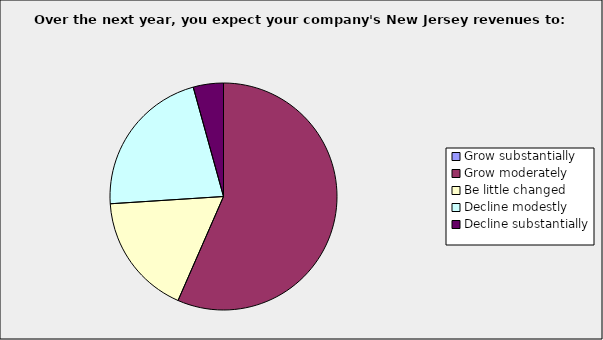
| Category | Series 0 |
|---|---|
| Grow substantially | 0 |
| Grow moderately | 0.565 |
| Be little changed | 0.174 |
| Decline modestly | 0.217 |
| Decline substantially | 0.043 |